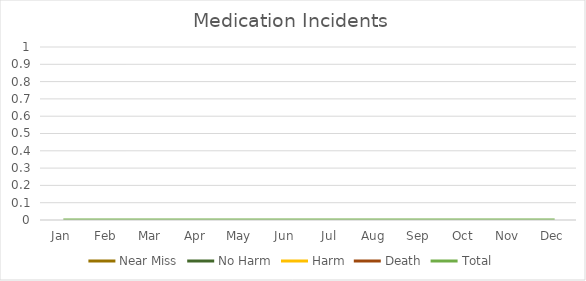
| Category | Near Miss | No Harm | Harm | Death | Total |
|---|---|---|---|---|---|
| Jan |  |  |  |  | 0 |
| Feb |  |  |  |  | 0 |
| Mar |  |  |  |  | 0 |
| Apr |  |  |  |  | 0 |
| May |  |  |  |  | 0 |
| Jun |  |  |  |  | 0 |
| Jul |  |  |  |  | 0 |
| Aug |  |  |  |  | 0 |
| Sep |  |  |  |  | 0 |
| Oct |  |  |  |  | 0 |
| Nov |  |  |  |  | 0 |
| Dec |  |  |  |  | 0 |